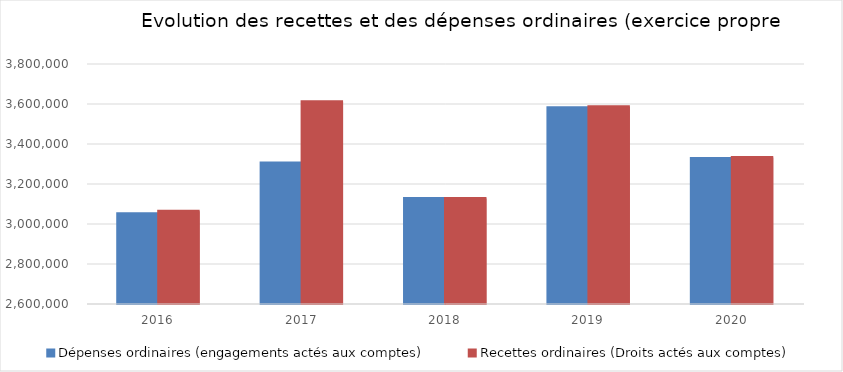
| Category | Dépenses ordinaires (engagements actés aux comptes) | Recettes ordinaires (Droits actés aux comptes) |
|---|---|---|
| 2016.0 | 3051737.87 | 3063314.51 |
| 2017.0 | 3304499.17 | 3611289.68 |
| 2018.0 | 3127538.07 | 3127606.94 |
| 2019.0 | 3580719.98 | 3585818.28 |
| 2020.0 | 3326964.54 | 3332247.91 |